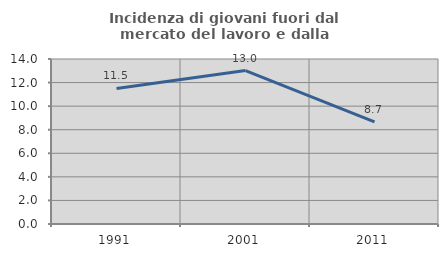
| Category | Incidenza di giovani fuori dal mercato del lavoro e dalla formazione  |
|---|---|
| 1991.0 | 11.504 |
| 2001.0 | 13.021 |
| 2011.0 | 8.671 |